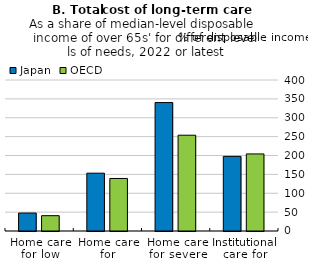
| Category | Japan | OECD |
|---|---|---|
| Home care for low needs | 47.568 | 40.592 |
| Home care for moderate needs | 153.146 | 139.123 |
| Home care for severe needs | 340.191 | 253.751 |
| Institutional care for severe needs | 197.645 | 204.148 |